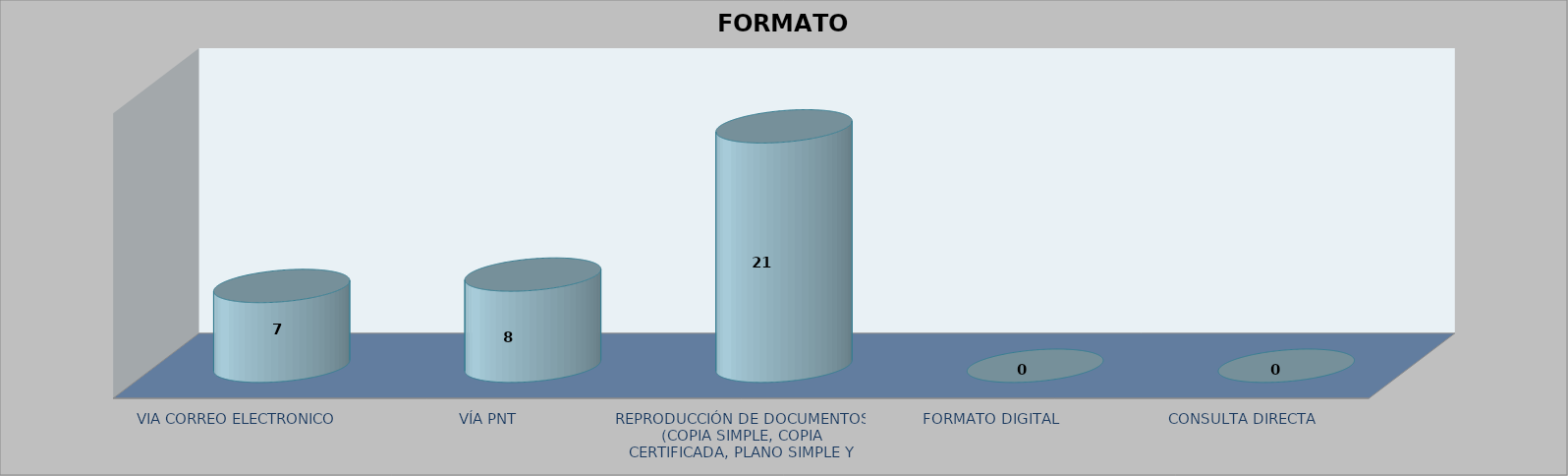
| Category |        FORMATO SOLICITADO | Series 1 | Series 2 |
|---|---|---|---|
| VIA CORREO ELECTRONICO |  |  | 7 |
| VÍA PNT |  |  | 8 |
| REPRODUCCIÓN DE DOCUMENTOS (COPIA SIMPLE, COPIA CERTIFICADA, PLANO SIMPLE Y PLANO CERTIFICADO) |  |  | 21 |
| FORMATO DIGITAL |  |  | 0 |
| CONSULTA DIRECTA |  |  | 0 |